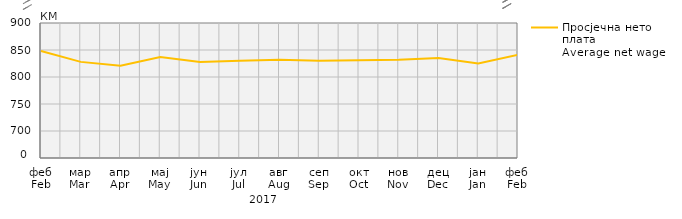
| Category | Просјечна нето плата
Average net wage |
|---|---|
| феб
Feb | 848 |
| мар
Mar | 828 |
| апр
Apr | 821 |
| мај
May | 837 |
| јун
Jun | 828 |
| јул
Jul | 830 |
| авг
Aug | 832 |
| сеп
Sep | 830 |
| окт
Oct | 831 |
| нов
Nov | 832 |
| дец
Dec | 835 |
| јан
Jan | 825 |
| феб
Feb | 841 |